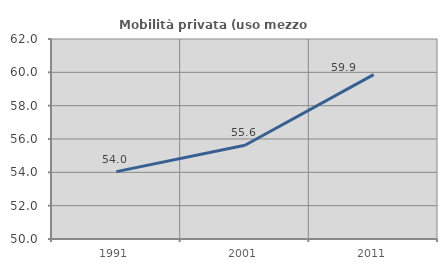
| Category | Mobilità privata (uso mezzo privato) |
|---|---|
| 1991.0 | 54.043 |
| 2001.0 | 55.623 |
| 2011.0 | 59.864 |